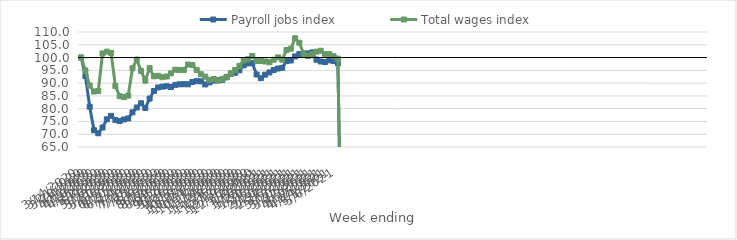
| Category | Payroll jobs index | Total wages index |
|---|---|---|
| 14/03/2020 | 100 | 100 |
| 21/03/2020 | 92.767 | 94.958 |
| 28/03/2020 | 80.739 | 89.066 |
| 04/04/2020 | 71.552 | 86.721 |
| 11/04/2020 | 70.366 | 86.897 |
| 18/04/2020 | 72.609 | 101.612 |
| 25/04/2020 | 75.851 | 102.32 |
| 02/05/2020 | 77.182 | 101.836 |
| 09/05/2020 | 75.6 | 88.882 |
| 16/05/2020 | 75.133 | 84.893 |
| 23/05/2020 | 75.772 | 84.535 |
| 30/05/2020 | 76.162 | 85.106 |
| 06/06/2020 | 78.551 | 95.81 |
| 13/06/2020 | 80.462 | 99.199 |
| 20/06/2020 | 82.118 | 94.766 |
| 27/06/2020 | 80.267 | 90.974 |
| 04/07/2020 | 83.954 | 95.863 |
| 11/07/2020 | 86.911 | 92.661 |
| 18/07/2020 | 88.285 | 92.852 |
| 25/07/2020 | 88.616 | 92.31 |
| 01/08/2020 | 88.78 | 92.584 |
| 08/08/2020 | 88.482 | 93.825 |
| 15/08/2020 | 89.304 | 95.251 |
| 22/08/2020 | 89.549 | 95.15 |
| 29/08/2020 | 89.559 | 95.169 |
| 05/09/2020 | 89.542 | 97.278 |
| 12/09/2020 | 90.434 | 97.089 |
| 19/09/2020 | 90.78 | 95.136 |
| 26/09/2020 | 90.692 | 93.479 |
| 03/10/2020 | 89.482 | 92.541 |
| 10/10/2020 | 90.262 | 91.279 |
| 17/10/2020 | 90.965 | 91.581 |
| 24/10/2020 | 91.119 | 90.966 |
| 31/10/2020 | 91.271 | 91.656 |
| 07/11/2020 | 92.418 | 92.233 |
| 14/11/2020 | 93.647 | 93.868 |
| 21/11/2020 | 94.072 | 95.102 |
| 28/11/2020 | 95.008 | 96.745 |
| 05/12/2020 | 96.962 | 98.892 |
| 12/12/2020 | 97.718 | 99.376 |
| 19/12/2020 | 97.814 | 100.642 |
| 26/12/2020 | 93.377 | 98.642 |
| 02/01/2021 | 91.914 | 98.659 |
| 09/01/2021 | 93.299 | 98.482 |
| 16/01/2021 | 94.188 | 98.163 |
| 23/01/2021 | 95.106 | 99.141 |
| 30/01/2021 | 95.716 | 100.06 |
| 06/02/2021 | 95.98 | 99.169 |
| 13/02/2021 | 98.622 | 102.974 |
| 20/02/2021 | 98.847 | 103.458 |
| 27/02/2021 | 100.447 | 107.572 |
| 06/03/2021 | 101.369 | 105.805 |
| 13/03/2021 | 101.612 | 101.488 |
| 20/03/2021 | 101.606 | 100.552 |
| 27/03/2021 | 102.011 | 101.326 |
| 03/04/2021 | 99.158 | 102.315 |
| 10/04/2021 | 98.464 | 102.681 |
| 17/04/2021 | 98.235 | 101.295 |
| 24/04/2021 | 98.907 | 101.314 |
| 01/05/2021 | 98.66 | 100.489 |
| 08/05/2021 | 97.731 | 99.592 |